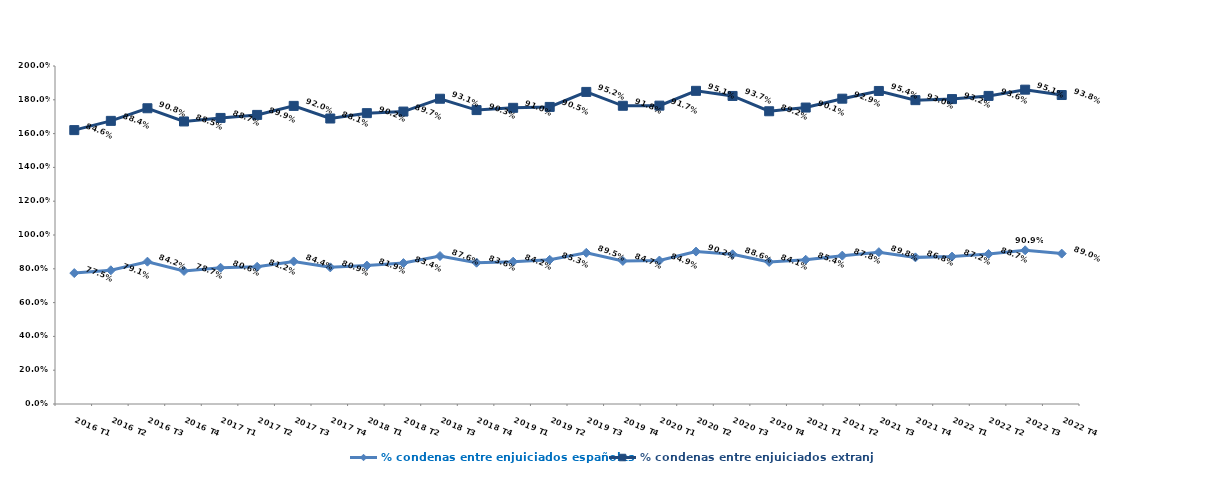
| Category | % condenas entre enjuiciados españoles | % condenas entre enjuiciados extranjeros |
|---|---|---|
| 2016 T1 | 0.775 | 0.846 |
| 2016 T2 | 0.791 | 0.884 |
| 2016 T3 | 0.842 | 0.908 |
| 2016 T4 | 0.787 | 0.885 |
| 2017 T1 | 0.806 | 0.887 |
| 2017 T2 | 0.812 | 0.899 |
| 2017 T3 | 0.844 | 0.92 |
| 2017 T4 | 0.809 | 0.881 |
| 2018 T1 | 0.819 | 0.902 |
| 2018 T2 | 0.834 | 0.897 |
| 2018 T3 | 0.876 | 0.931 |
| 2018 T4 | 0.836 | 0.903 |
| 2019 T1 | 0.842 | 0.91 |
| 2019 T2 | 0.853 | 0.905 |
| 2019 T3 | 0.895 | 0.952 |
| 2019 T4 | 0.847 | 0.918 |
| 2020 T1 | 0.849 | 0.917 |
| 2020 T2 | 0.902 | 0.951 |
| 2020 T3 | 0.886 | 0.937 |
| 2020 T4 | 0.841 | 0.892 |
| 2021 T1 | 0.854 | 0.901 |
| 2021 T2 | 0.878 | 0.929 |
| 2021 T3 | 0.898 | 0.954 |
| 2021 T4 | 0.868 | 0.93 |
| 2022 T1 | 0.872 | 0.932 |
| 2022 T2 | 0.887 | 0.936 |
| 2022 T3 | 0.909 | 0.951 |
| 2022 T4 | 0.89 | 0.938 |